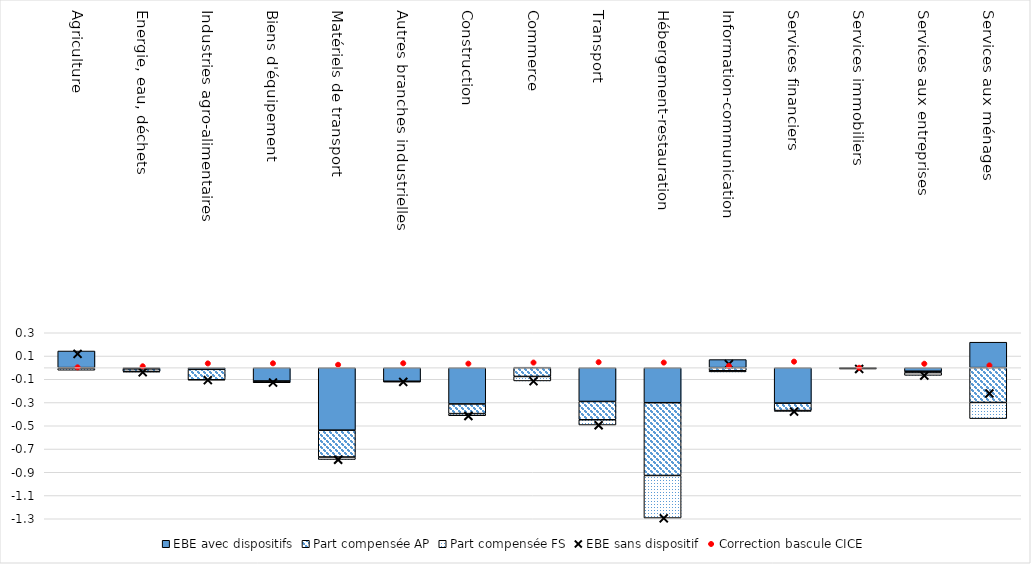
| Category | EBE avec dispositifs | Part compensée AP | Part compensée FS |
|---|---|---|---|
| Agriculture | 0.143 | -0.004 | -0.019 |
| Energie, eau, déchets | -0.011 | -0.022 | -0.005 |
| Industries agro-alimentaires | -0.015 | -0.09 | -0.001 |
| Biens d'équipement | -0.115 | -0.011 | 0 |
| Matériels de transport | -0.538 | -0.231 | -0.021 |
| Autres branches industrielles | -0.119 | -0.002 | 0 |
| Construction | -0.312 | -0.083 | -0.019 |
| Commerce | -0.001 | -0.075 | -0.039 |
| Transport | -0.291 | -0.157 | -0.045 |
| Hébergement-restauration | -0.302 | -0.626 | -0.366 |
| Information-communication | 0.069 | -0.027 | -0.01 |
| Services financiers | -0.305 | -0.064 | -0.007 |
| Services immobiliers | -0.003 | -0.005 | -0.002 |
| Services aux entreprises | -0.031 | -0.012 | -0.024 |
| Services aux ménages | 0.219 | -0.3 | -0.139 |